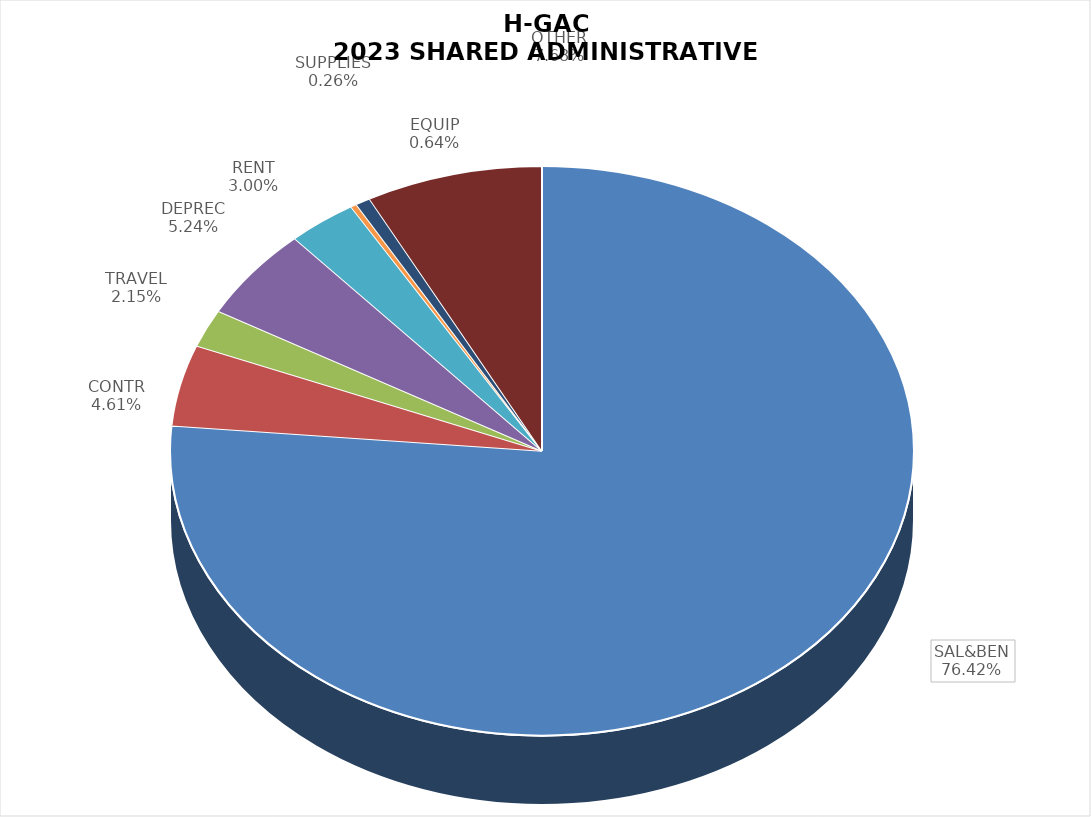
| Category | Series 0 |
|---|---|
| SAL&BEN | 0.764 |
| CONTR | 0.046 |
| TRAVEL | 0.021 |
| DEPREC | 0.052 |
| RENT | 0.03 |
| SUPPLIES | 0.003 |
| EQUIP | 0.006 |
| OTHER | 0.077 |